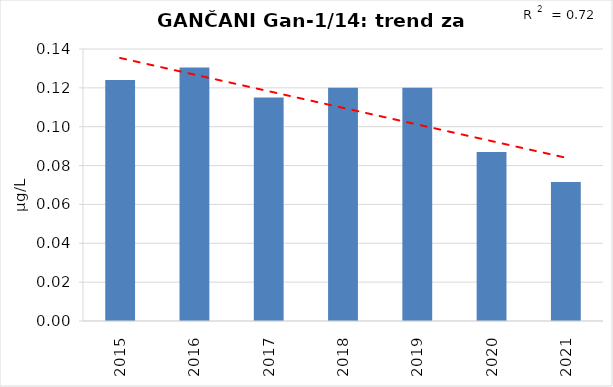
| Category | Vsota |
|---|---|
| 2015 | 0.124 |
| 2016 | 0.13 |
| 2017 | 0.115 |
| 2018 | 0.12 |
| 2019 | 0.12 |
| 2020 | 0.087 |
| 2021 | 0.072 |